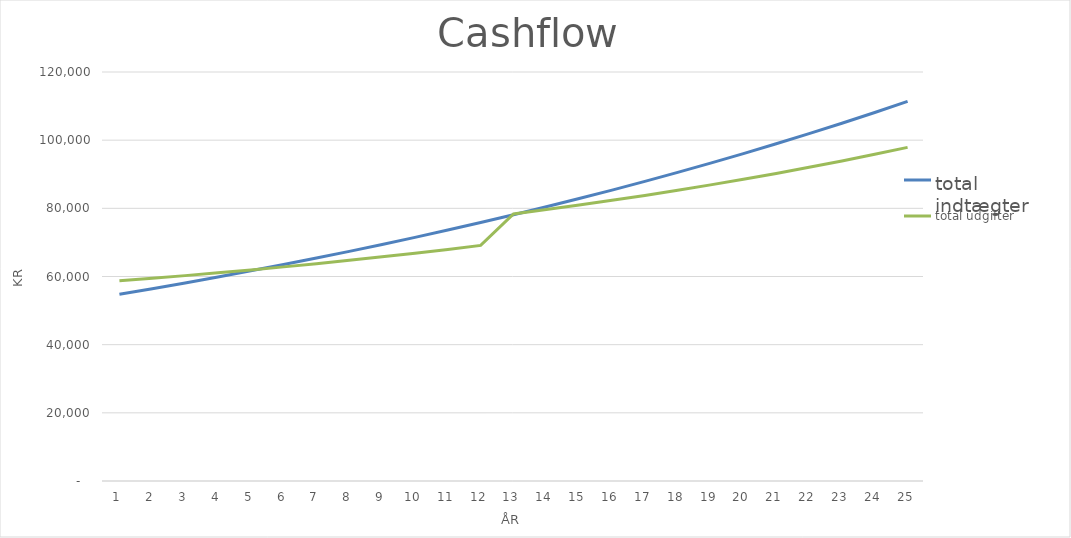
| Category | total indtægter | Series 1 | total udgifter |
|---|---|---|---|
| 0 | 54782.7 |  | 58729.436 |
| 1 | 56426.181 |  | 59475.987 |
| 2 | 58118.966 |  | 60257.33 |
| 3 | 59862.535 |  | 61074.907 |
| 4 | 61658.411 |  | 61930.214 |
| 5 | 63508.164 |  | 62824.805 |
| 6 | 65413.409 |  | 63760.294 |
| 7 | 67375.811 |  | 64738.357 |
| 8 | 69397.085 |  | 65760.733 |
| 9 | 71478.998 |  | 66829.23 |
| 10 | 73623.368 |  | 67945.723 |
| 11 | 75832.069 |  | 69112.159 |
| 12 | 78107.031 |  | 78358.619 |
| 13 | 80450.242 |  | 79631.085 |
| 14 | 82863.749 |  | 80959.793 |
| 15 | 85349.662 |  | 82347.004 |
| 16 | 87910.151 |  | 83795.065 |
| 17 | 90547.456 |  | 85306.411 |
| 18 | 93263.88 |  | 86883.571 |
| 19 | 96061.796 |  | 88529.166 |
| 20 | 98943.65 |  | 90245.919 |
| 21 | 101911.959 |  | 92036.654 |
| 22 | 104969.318 |  | 93904.3 |
| 23 | 108118.398 |  | 95851.899 |
| 24 | 111361.95 |  | 97882.604 |